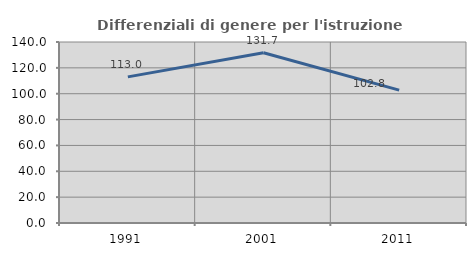
| Category | Differenziali di genere per l'istruzione superiore |
|---|---|
| 1991.0 | 113.03 |
| 2001.0 | 131.707 |
| 2011.0 | 102.785 |